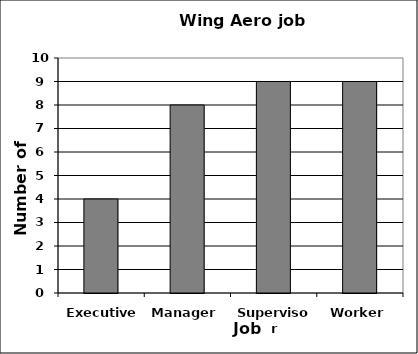
| Category | Number |
|---|---|
| Executive | 4 |
| Manager | 8 |
| Supervisor | 9 |
| Worker | 9 |